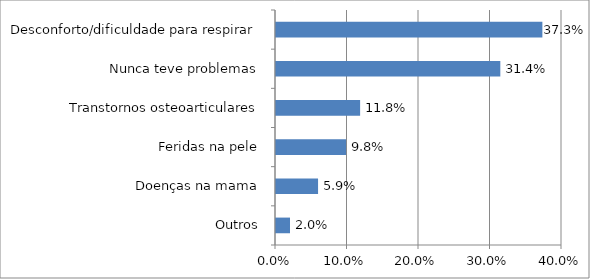
| Category | Series 0 |
|---|---|
| Outros | 0.02 |
| Doenças na mama | 0.059 |
| Feridas na pele | 0.098 |
| Transtornos osteoarticulares | 0.118 |
| Nunca teve problemas | 0.314 |
| Desconforto/dificuldade para respirar | 0.373 |